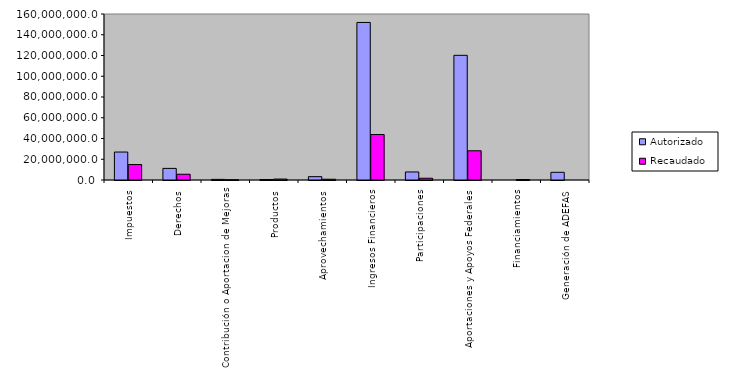
| Category | Autorizado | Recaudado |
|---|---|---|
| 0 | 26952986.1 | 14904332.3 |
| 1 | 11179808.8 | 5556344.9 |
| 2 | 600019.2 | 225466.8 |
| 3 | 441606.4 | 913324.3 |
| 4 | 3237876.4 | 728954.1 |
| 5 | 151857344.4 | 43836305 |
| 6 | 7744493.6 | 1697142.5 |
| 7 | 120177320.4 | 28166615.2 |
| 8 | 0 | 459442.9 |
| 9 | 7410491.1 | 0 |